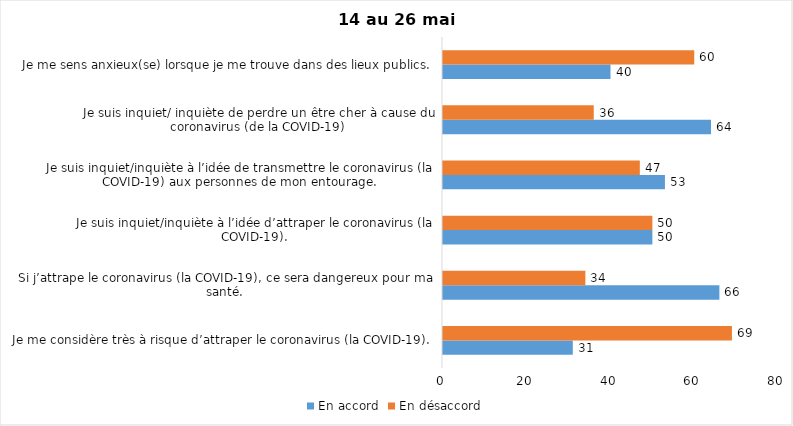
| Category | En accord | En désaccord |
|---|---|---|
| Je me considère très à risque d’attraper le coronavirus (la COVID-19). | 31 | 69 |
| Si j’attrape le coronavirus (la COVID-19), ce sera dangereux pour ma santé. | 66 | 34 |
| Je suis inquiet/inquiète à l’idée d’attraper le coronavirus (la COVID-19). | 50 | 50 |
| Je suis inquiet/inquiète à l’idée de transmettre le coronavirus (la COVID-19) aux personnes de mon entourage. | 53 | 47 |
| Je suis inquiet/ inquiète de perdre un être cher à cause du coronavirus (de la COVID-19) | 64 | 36 |
| Je me sens anxieux(se) lorsque je me trouve dans des lieux publics. | 40 | 60 |